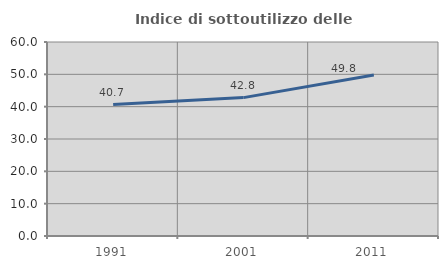
| Category | Indice di sottoutilizzo delle abitazioni  |
|---|---|
| 1991.0 | 40.664 |
| 2001.0 | 42.8 |
| 2011.0 | 49.793 |